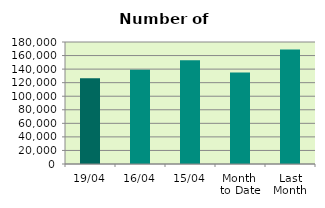
| Category | Series 0 |
|---|---|
| 19/04 | 126448 |
| 16/04 | 139018 |
| 15/04 | 153050 |
| Month 
to Date | 134818.364 |
| Last
Month | 168827.304 |